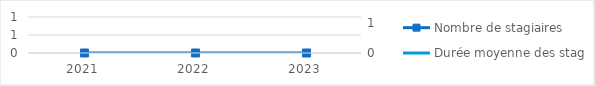
| Category | Nombre de stagiaires |
|---|---|
| 2021.0 | 0 |
| 2022.0 | 0 |
| 2023.0 | 0 |